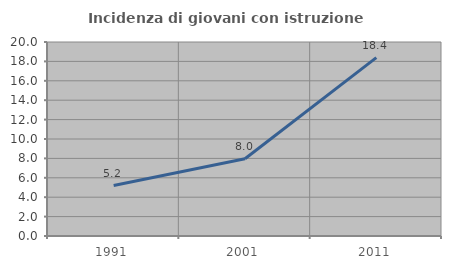
| Category | Incidenza di giovani con istruzione universitaria |
|---|---|
| 1991.0 | 5.201 |
| 2001.0 | 7.961 |
| 2011.0 | 18.391 |